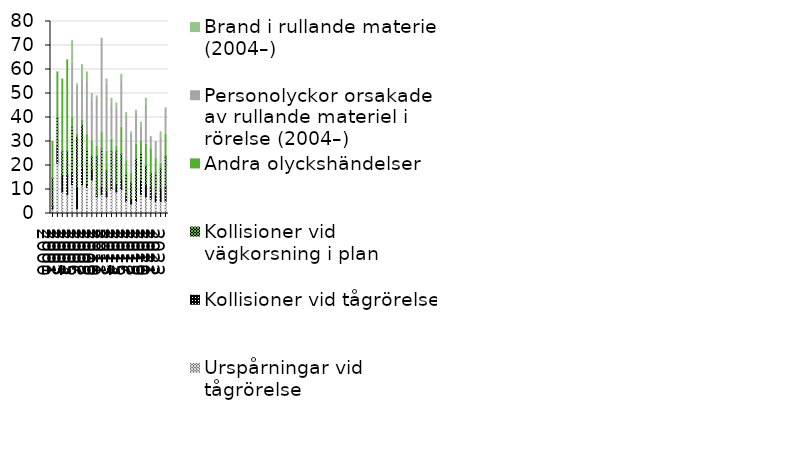
| Category | Urspårningar vid tågrörelse  | Kollisioner vid tågrörelse  | Kollisioner vid vägkorsning i plan | Andra olyckshändelser | Personolyckor orsakade av rullande materiel i rörelse (2004–) | Brand i rullande materiel (2004–) |
|---|---|---|---|---|---|---|
| 2000 | 2 | 1 | 12 | 15 | 0 | 0 |
| 2001 | 21 | 7 | 12 | 19 | 0 | 0 |
| 2002 | 9 | 7 | 10 | 30 | 0 | 0 |
| 2003 | 8 | 8 | 10 | 38 | 0 | 0 |
| 2004 | 12 | 5 | 19 | 4 | 23 | 9 |
| 2005 | 2 | 9 | 21 | 1 | 20 | 1 |
| 2006 | 12 | 7 | 18 | 2 | 17 | 6 |
| 2007 | 11 | 1 | 15 | 6 | 22 | 4 |
| 2008 | 14 | 4 | 6 | 6 | 17 | 3 |
| 2009 | 7 | 1 | 16 | 4 | 20 | 1 |
| 2010 | 8 | 3 | 16 | 7 | 39 | 0 |
| 2011 | 7 | 2 | 9 | 8 | 28 | 2 |
| 2012 | 10 | 4 | 12 | 5 | 14 | 3 |
| 2013 | 9 | 3 | 14 | 2 | 16 | 2 |
| 2014 | 10 | 4 | 11 | 11 | 19 | 3 |
| 2015 | 5 | 3 | 9 | 5 | 18 | 2 |
| 2016 | 4 | 2 | 7 | 4 | 16 | 1 |
| 2017 | 5 | 2 | 16 | 6 | 13 | 1 |
| 2018 | 8 | 6 | 11 | 5 | 6 | 2 |
| 2019 | 7 | 5 | 8 | 9 | 16 | 3 |
| 2020 | 6 | 5 | 6 | 10 | 5 | 0 |
| 2021 | 5 | 3 | 9 | 6 | 7 | 0 |
| 2022 | 5 | 5 | 9 | 2 | 11 | 2 |
| 2023 | 5 | 6 | 13 | 9 | 11 | 0 |